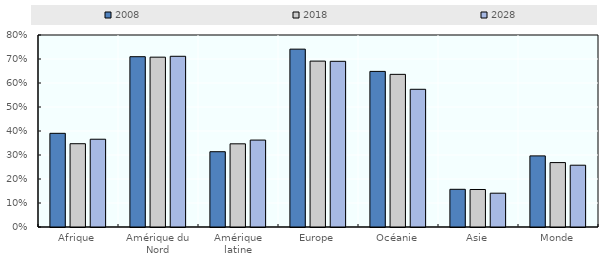
| Category | 2008 | 2018 | 2028 |
|---|---|---|---|
| Afrique | 0.39 | 0.347 | 0.366 |
| Amérique du Nord | 0.71 | 0.708 | 0.711 |
| Amérique latine | 0.314 | 0.347 | 0.362 |
| Europe | 0.741 | 0.691 | 0.69 |
| Océanie | 0.648 | 0.636 | 0.574 |
| Asie | 0.157 | 0.156 | 0.141 |
| Monde | 0.296 | 0.268 | 0.257 |